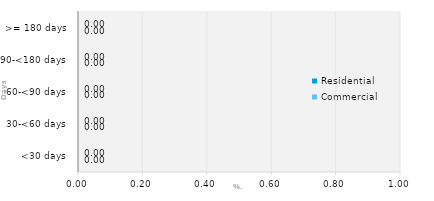
| Category | Commercial | Residential |
|---|---|---|
| <30 days | 0 | 0 |
| 30-<60 days | 0 | 0 |
| 60-<90 days | 0 | 0 |
| 90-<180 days | 0 | 0 |
| >= 180 days | 0 | 0 |